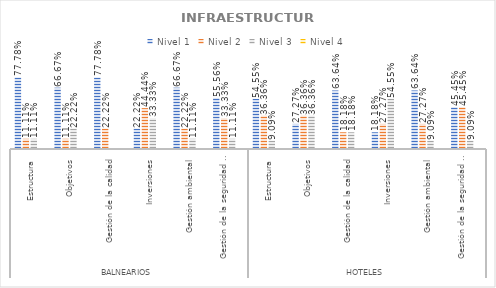
| Category | Nivel 1 | Nivel 2 | Nivel 3 | Nivel 4 |
|---|---|---|---|---|
| 0 | 0.778 | 0.111 | 0.111 | 0 |
| 1 | 0.667 | 0.111 | 0.222 | 0 |
| 2 | 0.778 | 0.222 | 0 | 0 |
| 3 | 0.222 | 0.444 | 0.333 | 0 |
| 4 | 0.667 | 0.222 | 0.111 | 0 |
| 5 | 0.556 | 0.333 | 0.111 | 0 |
| 6 | 0.545 | 0.364 | 0.091 | 0 |
| 7 | 0.273 | 0.364 | 0.364 | 0 |
| 8 | 0.636 | 0.182 | 0.182 | 0 |
| 9 | 0.182 | 0.273 | 0.545 | 0 |
| 10 | 0.636 | 0.273 | 0.091 | 0 |
| 11 | 0.455 | 0.455 | 0.091 | 0 |